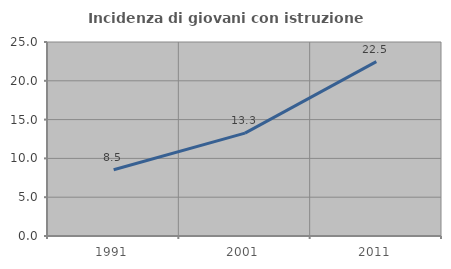
| Category | Incidenza di giovani con istruzione universitaria |
|---|---|
| 1991.0 | 8.529 |
| 2001.0 | 13.254 |
| 2011.0 | 22.477 |